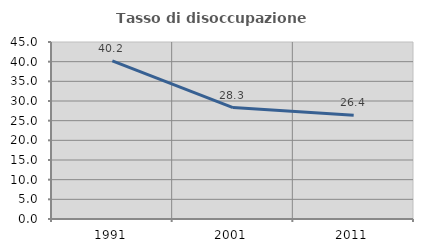
| Category | Tasso di disoccupazione giovanile  |
|---|---|
| 1991.0 | 40.223 |
| 2001.0 | 28.327 |
| 2011.0 | 26.406 |